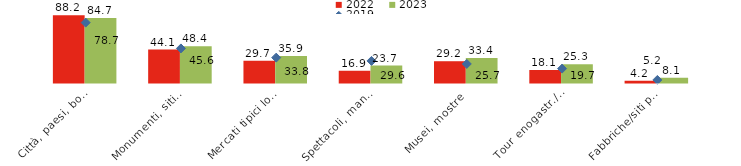
| Category | 2022 | 2023 |
|---|---|---|
| Città, paesi, borghi | 88.2 | 84.7 |
| Monumenti, siti archeologici | 44.1 | 48.4 |
| Mercati tipici locali | 29.7 | 35.9 |
| Spettacoli, manifestazioni | 16.9 | 23.7 |
| Musei, mostre | 29.2 | 33.4 |
| Tour enogastr./degustazioni | 18.1 | 25.3 |
| Fabbriche/siti per la produz.di beni  | 4.2 | 8.1 |